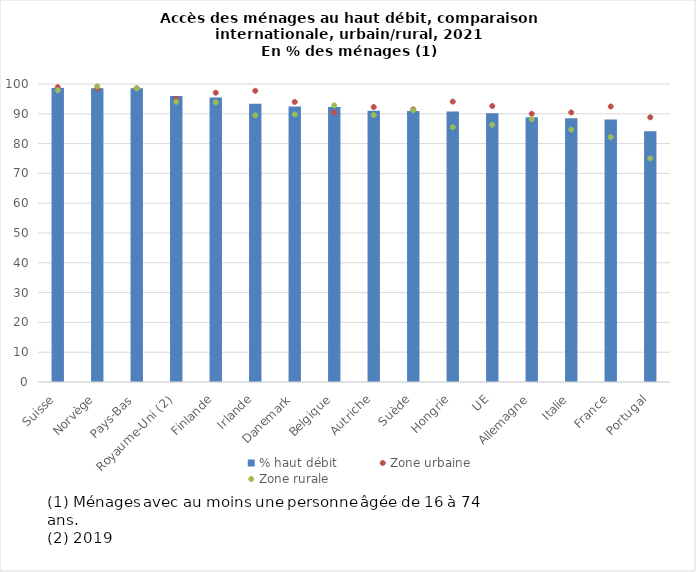
| Category | % haut débit |
|---|---|
| Suisse | 98.673 |
| Norvège | 98.601 |
| Pays-Bas | 98.557 |
| Royaume-Uni (2) | 96 |
| Finlande | 95.475 |
| Irlande | 93.349 |
| Danemark | 92.466 |
| Belgique | 92.3 |
| Autriche | 91.009 |
| Suède | 90.963 |
| Hongrie | 90.781 |
| UE | 90.211 |
| Allemagne | 88.838 |
| Italie | 88.488 |
| France | 88.114 |
| Portugal | 84.104 |